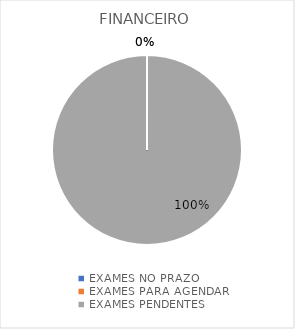
| Category | FINANCEIRO |
|---|---|
| EXAMES NO PRAZO | 0 |
| EXAMES PARA AGENDAR | 0 |
| EXAMES PENDENTES | 1 |